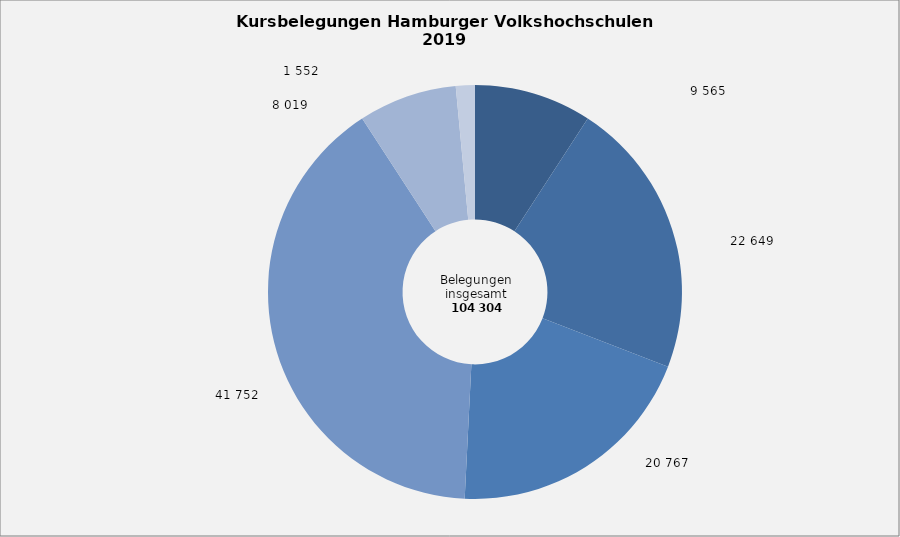
| Category | Anteil in Prozent |
|---|---|
| Politik, Gesellschaft, Umwelt | 9.17 |
| Kultur, Gestalten | 21.714 |
| Gesundheit | 19.91 |
| Sprachen | 40.029 |
| Arbeit, Beruf | 7.688 |
| Grundbildung, Schulabschlüsse | 1.488 |